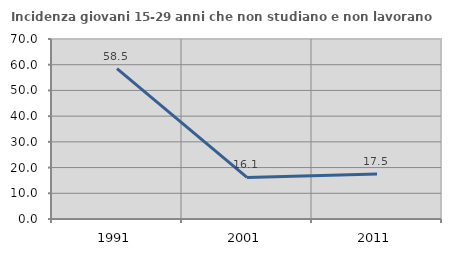
| Category | Incidenza giovani 15-29 anni che non studiano e non lavorano  |
|---|---|
| 1991.0 | 58.503 |
| 2001.0 | 16.149 |
| 2011.0 | 17.544 |